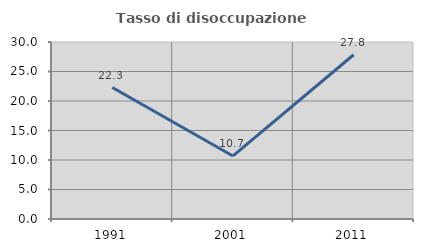
| Category | Tasso di disoccupazione giovanile  |
|---|---|
| 1991.0 | 22.277 |
| 2001.0 | 10.687 |
| 2011.0 | 27.835 |